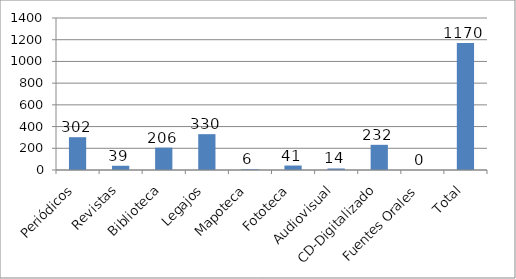
| Category | Series 0 |
|---|---|
| Periódicos | 302 |
| Revistas | 39 |
| Biblioteca | 206 |
| Legajos | 330 |
| Mapoteca | 6 |
| Fototeca | 41 |
| Audiovisual | 14 |
| CD-Digitalizado | 232 |
| Fuentes Orales | 0 |
| Total | 1170 |